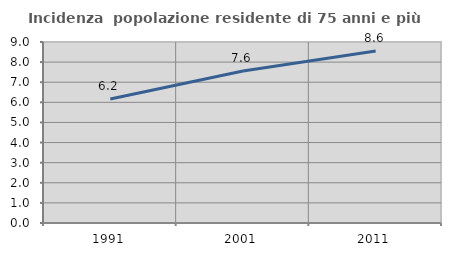
| Category | Incidenza  popolazione residente di 75 anni e più |
|---|---|
| 1991.0 | 6.162 |
| 2001.0 | 7.561 |
| 2011.0 | 8.557 |